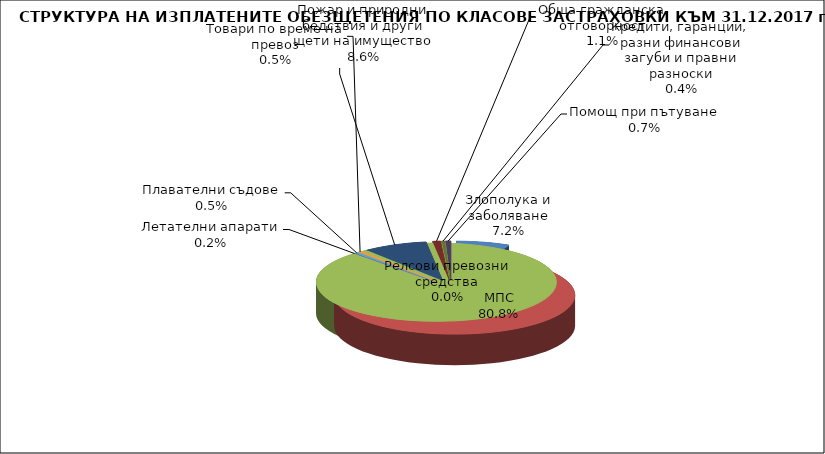
| Category | Злополука и заболяване |
|---|---|
| Злополука и заболяване | 0.072 |
| МПС | 0.808 |
| Релсови превозни средства | 0 |
| Летателни апарати | 0.002 |
| Плавателни съдове | 0.005 |
| Товари по време на превоз | 0.005 |
| Пожар и природни бедствия и други щети на имущество | 0.086 |
| Обща гражданска отговорност | 0.011 |
| Кредити, гаранции, разни финансови загуби и правни разноски | 0.004 |
| Помощ при пътуване | 0.007 |